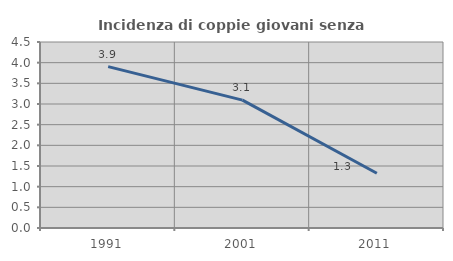
| Category | Incidenza di coppie giovani senza figli |
|---|---|
| 1991.0 | 3.905 |
| 2001.0 | 3.094 |
| 2011.0 | 1.325 |